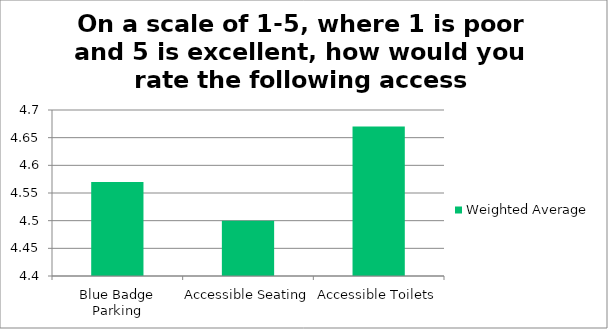
| Category | Weighted Average |
|---|---|
| Blue Badge Parking | 4.57 |
| Accessible Seating | 4.5 |
| Accessible Toilets | 4.67 |